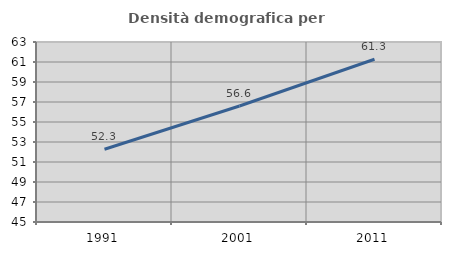
| Category | Densità demografica |
|---|---|
| 1991.0 | 52.27 |
| 2001.0 | 56.597 |
| 2011.0 | 61.273 |